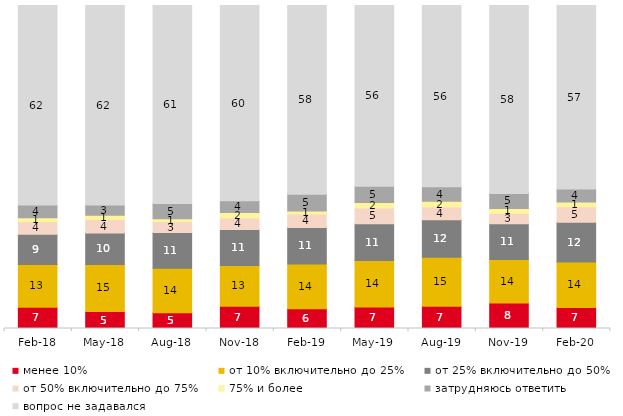
| Category | менее 10% | от 10% включительно до 25% | от 25% включительно до 50% | от 50% включительно до 75% | 75% и более | затрудняюсь ответить | вопрос не задавался |
|---|---|---|---|---|---|---|---|
| 2018-02-01 | 6.6 | 13.25 | 9.35 | 3.85 | 1.25 | 3.9 | 61.8 |
| 2018-05-01 | 5.25 | 14.6 | 9.7 | 4.2 | 1.35 | 3.1 | 61.8 |
| 2018-08-01 | 4.9 | 13.75 | 11.05 | 3.4 | 0.9 | 4.7 | 61.3 |
| 2018-11-01 | 6.886 | 12.625 | 11.128 | 3.543 | 1.697 | 3.643 | 60.479 |
| 2019-02-01 | 6.1 | 13.85 | 11.3 | 4.2 | 0.95 | 5.15 | 58.45 |
| 2019-05-01 | 6.686 | 14.364 | 11.392 | 4.854 | 1.734 | 5.002 | 55.968 |
| 2019-08-01 | 6.893 | 15.135 | 11.638 | 3.946 | 1.748 | 4.496 | 56.144 |
| 2019-11-01 | 7.871 | 13.515 | 11.04 | 3.267 | 1.485 | 4.604 | 58.218 |
| 2020-02-01 | 6.535 | 14.059 | 12.277 | 4.802 | 1.485 | 4.059 | 56.782 |